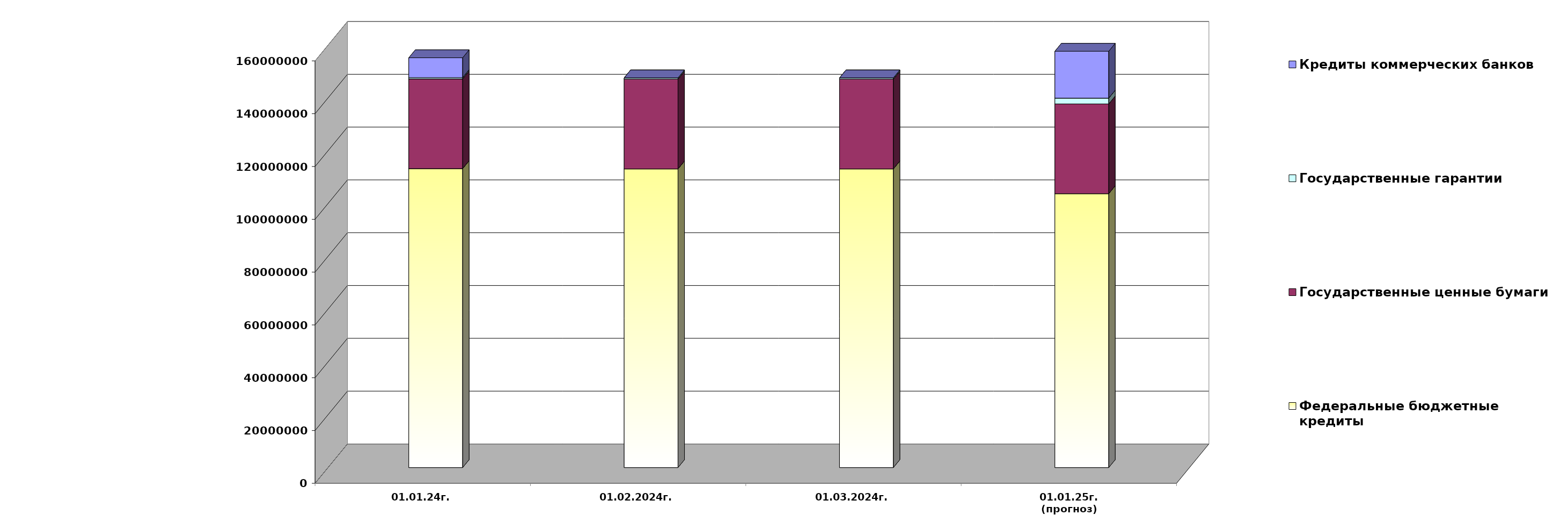
| Category | Федеральные бюджетные кредиты | Государственные ценные бумаги  | Государственные гарантии | Кредиты коммерческих банков |
|---|---|---|---|---|
| 01.01.24г. | 113223150.103 | 34000000 | 492844.914 | 7500000 |
| 01.02.2024г. | 113101358.397 | 34000000 | 490073.841 | 0 |
| 01.03.2024г. | 113101358.397 | 34000000 | 490331.207 | 0 |
| 01.01.25г.
(прогноз) | 103727859.3 | 34000000 | 2193508.4 | 17760298.9 |